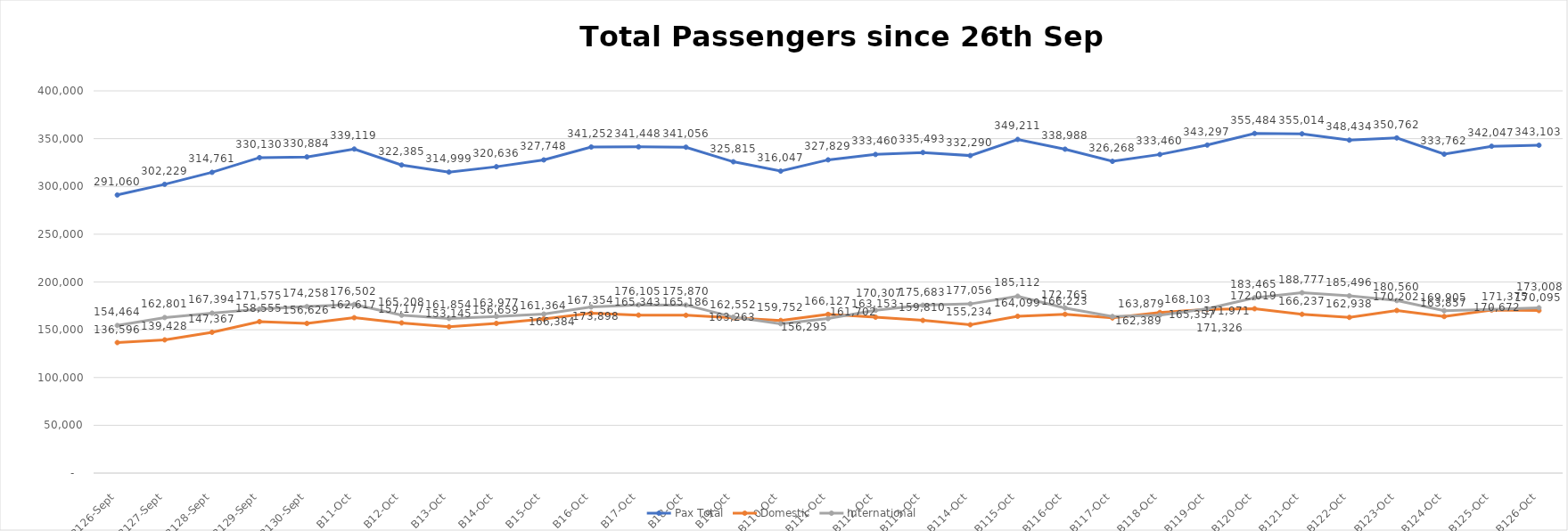
| Category | Pax Total | Domestic | International |
|---|---|---|---|
| 2023-09-26 | 291060 | 136596 | 154464 |
| 2023-09-27 | 302229 | 139428 | 162801 |
| 2023-09-28 | 314761 | 147367 | 167394 |
| 2023-09-29 | 330130 | 158555 | 171575 |
| 2023-09-30 | 330884 | 156626 | 174258 |
| 2023-10-01 | 339119 | 162617 | 176502 |
| 2023-10-02 | 322385 | 157177 | 165208 |
| 2023-10-03 | 314999 | 153145 | 161854 |
| 2023-10-04 | 320636 | 156659 | 163977 |
| 2023-10-05 | 327748 | 161364 | 166384 |
| 2023-10-06 | 341252 | 167354 | 173898 |
| 2023-10-07 | 341448 | 165343 | 176105 |
| 2023-10-08 | 341056 | 165186 | 175870 |
| 2023-10-09 | 325815 | 162552 | 163263 |
| 2023-10-10 | 316047 | 159752 | 156295 |
| 2023-10-11 | 327829 | 166127 | 161702 |
| 2023-10-12 | 333460 | 163153 | 170307 |
| 2023-10-13 | 335493 | 159810 | 175683 |
| 2023-10-14 | 332290 | 155234 | 177056 |
| 2023-10-15 | 349211 | 164099 | 185112 |
| 2023-10-16 | 338988 | 166223 | 172765 |
| 2023-10-17 | 326268 | 162389 | 163879 |
| 2023-10-18 | 333460 | 168103 | 165357 |
| 2023-10-19 | 343297 | 171326 | 171971 |
| 2023-10-20 | 355484 | 172019 | 183465 |
| 2023-10-21 | 355014 | 166237 | 188777 |
| 2023-10-22 | 348434 | 162938 | 185496 |
| 2023-10-23 | 350762 | 170202 | 180560 |
| 2023-10-24 | 333762 | 163857 | 169905 |
| 2023-10-25 | 342047 | 170672 | 171375 |
| 2023-10-26 | 343103 | 170095 | 173008 |